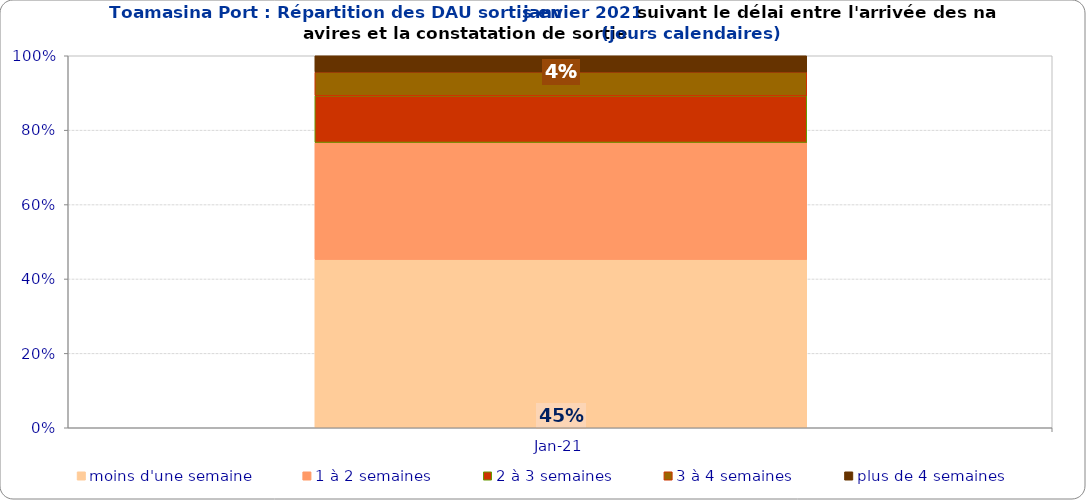
| Category | moins d'une semaine | 1 à 2 semaines | 2 à 3 semaines | 3 à 4 semaines | plus de 4 semaines |
|---|---|---|---|---|---|
| 2021-01-01 | 0.452 | 0.315 | 0.126 | 0.064 | 0.044 |